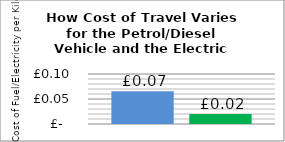
| Category | Petrol/Diesel | EV |
|---|---|---|
| 0 | 0.065 | 0.02 |